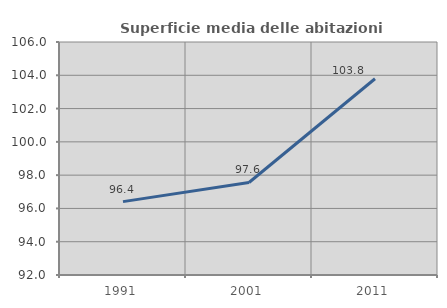
| Category | Superficie media delle abitazioni occupate |
|---|---|
| 1991.0 | 96.409 |
| 2001.0 | 97.559 |
| 2011.0 | 103.793 |